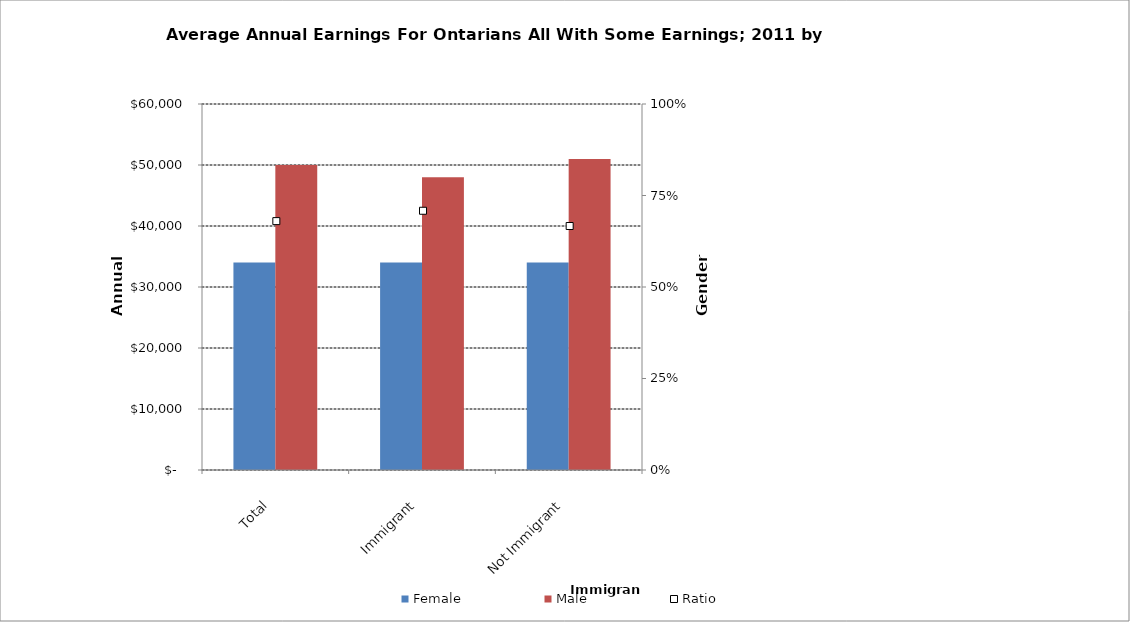
| Category | Female | Male |
|---|---|---|
| Total | 34000 | 50000 |
|  Immigrant  | 34000 | 48000 |
|  Not Immigrant  | 34000 | 51000 |